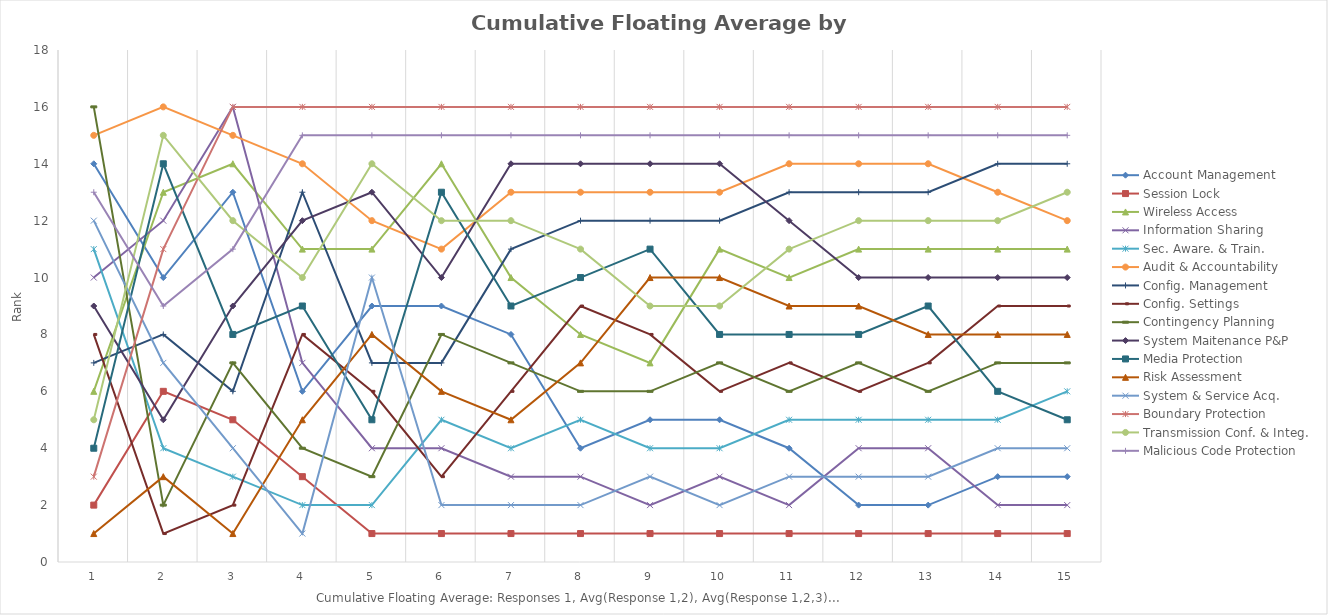
| Category | Account Management | Session Lock | Wireless Access | Information Sharing | Sec. Aware. & Train. | Audit & Accountability | Config. Management | Config. Settings | Contingency Planning | System Maitenance P&P | Media Protection | Risk Assessment | System & Service Acq. | Boundary Protection | Transmission Conf. & Integ. | Malicious Code Protection |
|---|---|---|---|---|---|---|---|---|---|---|---|---|---|---|---|---|
| 0 | 14 | 2 | 6 | 10 | 11 | 15 | 7 | 8 | 16 | 9 | 4 | 1 | 12 | 3 | 5 | 13 |
| 1 | 10 | 6 | 13 | 12 | 4 | 16 | 8 | 1 | 2 | 5 | 14 | 3 | 7 | 11 | 15 | 9 |
| 2 | 13 | 5 | 14 | 16 | 3 | 15 | 6 | 2 | 7 | 9 | 8 | 1 | 4 | 16 | 12 | 11 |
| 3 | 6 | 3 | 11 | 7 | 2 | 14 | 13 | 8 | 4 | 12 | 9 | 5 | 1 | 16 | 10 | 15 |
| 4 | 9 | 1 | 11 | 4 | 2 | 12 | 7 | 6 | 3 | 13 | 5 | 8 | 10 | 16 | 14 | 15 |
| 5 | 9 | 1 | 14 | 4 | 5 | 11 | 7 | 3 | 8 | 10 | 13 | 6 | 2 | 16 | 12 | 15 |
| 6 | 8 | 1 | 10 | 3 | 4 | 13 | 11 | 6 | 7 | 14 | 9 | 5 | 2 | 16 | 12 | 15 |
| 7 | 4 | 1 | 8 | 3 | 5 | 13 | 12 | 9 | 6 | 14 | 10 | 7 | 2 | 16 | 11 | 15 |
| 8 | 5 | 1 | 7 | 2 | 4 | 13 | 12 | 8 | 6 | 14 | 11 | 10 | 3 | 16 | 9 | 15 |
| 9 | 5 | 1 | 11 | 3 | 4 | 13 | 12 | 6 | 7 | 14 | 8 | 10 | 2 | 16 | 9 | 15 |
| 10 | 4 | 1 | 10 | 2 | 5 | 14 | 13 | 7 | 6 | 12 | 8 | 9 | 3 | 16 | 11 | 15 |
| 11 | 2 | 1 | 11 | 4 | 5 | 14 | 13 | 6 | 7 | 10 | 8 | 9 | 3 | 16 | 12 | 15 |
| 12 | 2 | 1 | 11 | 4 | 5 | 14 | 13 | 7 | 6 | 10 | 9 | 8 | 3 | 16 | 12 | 15 |
| 13 | 3 | 1 | 11 | 2 | 5 | 13 | 14 | 9 | 7 | 10 | 6 | 8 | 4 | 16 | 12 | 15 |
| 14 | 3 | 1 | 11 | 2 | 6 | 12 | 14 | 9 | 7 | 10 | 5 | 8 | 4 | 16 | 13 | 15 |